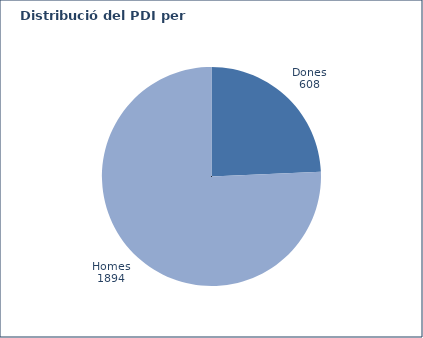
| Category | Series 0 |
|---|---|
| Dones | 608 |
| Homes | 1894 |